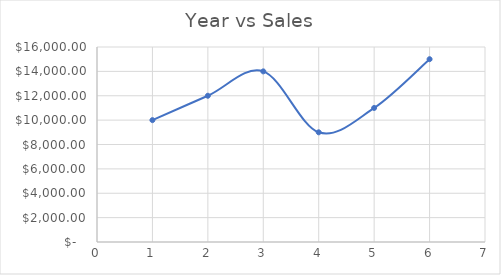
| Category | Series 0 |
|---|---|
| 1.0 | 10000 |
| 2.0 | 12000 |
| 3.0 | 14000 |
| 4.0 | 9000 |
| 5.0 | 11000 |
| 6.0 | 15000 |